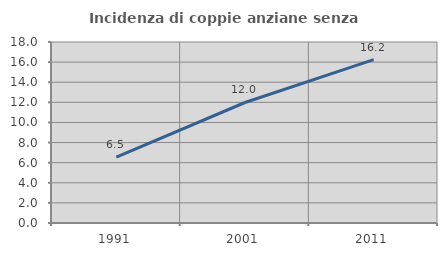
| Category | Incidenza di coppie anziane senza figli  |
|---|---|
| 1991.0 | 6.545 |
| 2001.0 | 11.983 |
| 2011.0 | 16.246 |